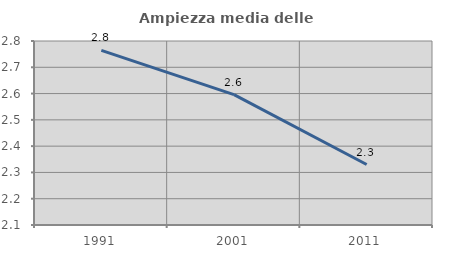
| Category | Ampiezza media delle famiglie |
|---|---|
| 1991.0 | 2.764 |
| 2001.0 | 2.596 |
| 2011.0 | 2.33 |